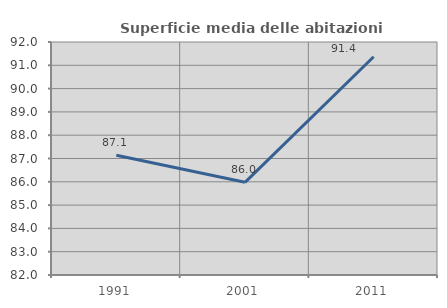
| Category | Superficie media delle abitazioni occupate |
|---|---|
| 1991.0 | 87.136 |
| 2001.0 | 85.977 |
| 2011.0 | 91.367 |